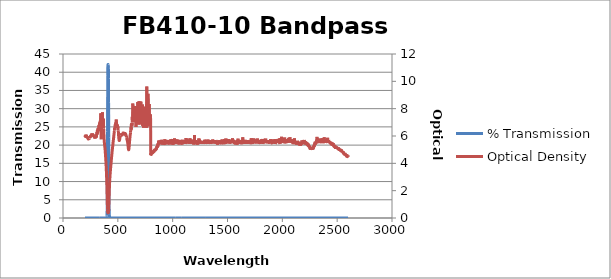
| Category | % Transmission |
|---|---|
| 2600.0 | 0.003 |
| 2599.0 | 0.003 |
| 2598.0 | 0.003 |
| 2597.0 | 0.003 |
| 2596.0 | 0.003 |
| 2595.0 | 0.003 |
| 2594.0 | 0.003 |
| 2593.0 | 0.003 |
| 2592.0 | 0.003 |
| 2591.0 | 0.003 |
| 2590.0 | 0.003 |
| 2589.0 | 0.003 |
| 2588.0 | 0.003 |
| 2587.0 | 0.003 |
| 2586.0 | 0.003 |
| 2585.0 | 0.003 |
| 2584.0 | 0.003 |
| 2583.0 | 0.002 |
| 2582.0 | 0.002 |
| 2581.0 | 0.003 |
| 2580.0 | 0.003 |
| 2579.0 | 0.002 |
| 2578.0 | 0.002 |
| 2577.0 | 0.002 |
| 2576.0 | 0.002 |
| 2575.0 | 0.002 |
| 2574.0 | 0.002 |
| 2573.0 | 0.002 |
| 2572.0 | 0.002 |
| 2571.0 | 0.002 |
| 2570.0 | 0.002 |
| 2569.0 | 0.003 |
| 2568.0 | 0.002 |
| 2567.0 | 0.002 |
| 2566.0 | 0.002 |
| 2565.0 | 0.002 |
| 2564.0 | 0.002 |
| 2563.0 | 0.002 |
| 2562.0 | 0.002 |
| 2561.0 | 0.002 |
| 2560.0 | 0.002 |
| 2559.0 | 0.002 |
| 2558.0 | 0.002 |
| 2557.0 | 0.002 |
| 2556.0 | 0.002 |
| 2555.0 | 0.001 |
| 2554.0 | 0.001 |
| 2553.0 | 0.002 |
| 2552.0 | 0.001 |
| 2551.0 | 0.001 |
| 2550.0 | 0.001 |
| 2549.0 | 0.002 |
| 2548.0 | 0.001 |
| 2547.0 | 0.001 |
| 2546.0 | 0.001 |
| 2545.0 | 0.001 |
| 2544.0 | 0.002 |
| 2543.0 | 0.001 |
| 2542.0 | 0.001 |
| 2541.0 | 0.001 |
| 2540.0 | 0.001 |
| 2539.0 | 0.001 |
| 2538.0 | 0.001 |
| 2537.0 | 0.001 |
| 2536.0 | 0.001 |
| 2535.0 | 0.001 |
| 2534.0 | 0.001 |
| 2533.0 | 0.001 |
| 2532.0 | 0.001 |
| 2531.0 | 0.001 |
| 2530.0 | 0.001 |
| 2529.0 | 0.001 |
| 2528.0 | 0.001 |
| 2527.0 | 0.001 |
| 2526.0 | 0.001 |
| 2525.0 | 0.001 |
| 2524.0 | 0.001 |
| 2523.0 | 0.001 |
| 2522.0 | 0.001 |
| 2521.0 | 0.001 |
| 2520.0 | 0.001 |
| 2519.0 | 0.001 |
| 2518.0 | 0.001 |
| 2517.0 | 0.001 |
| 2516.0 | 0.001 |
| 2515.0 | 0.001 |
| 2514.0 | 0.001 |
| 2513.0 | 0.001 |
| 2512.0 | 0.001 |
| 2511.0 | 0.001 |
| 2510.0 | 0.001 |
| 2509.0 | 0.001 |
| 2508.0 | 0.001 |
| 2507.0 | 0.001 |
| 2506.0 | 0.001 |
| 2505.0 | 0.001 |
| 2504.0 | 0.001 |
| 2503.0 | 0.001 |
| 2502.0 | 0.001 |
| 2501.0 | 0.001 |
| 2500.0 | 0.001 |
| 2499.0 | 0.001 |
| 2498.0 | 0.001 |
| 2497.0 | 0.001 |
| 2496.0 | 0.001 |
| 2495.0 | 0.001 |
| 2494.0 | 0.001 |
| 2493.0 | 0.001 |
| 2492.0 | 0.001 |
| 2491.0 | 0.001 |
| 2490.0 | 0.001 |
| 2489.0 | 0.001 |
| 2488.0 | 0.001 |
| 2487.0 | 0.001 |
| 2486.0 | 0.001 |
| 2485.0 | 0.001 |
| 2484.0 | 0.001 |
| 2483.0 | 0.001 |
| 2482.0 | 0.001 |
| 2481.0 | 0.001 |
| 2480.0 | 0 |
| 2479.0 | 0.001 |
| 2478.0 | 0 |
| 2477.0 | 0.001 |
| 2476.0 | 0.001 |
| 2475.0 | 0.001 |
| 2474.0 | 0 |
| 2473.0 | 0.001 |
| 2472.0 | 0.001 |
| 2471.0 | 0.001 |
| 2470.0 | 0 |
| 2469.0 | 0 |
| 2468.0 | 0 |
| 2467.0 | 0 |
| 2466.0 | 0 |
| 2465.0 | 0.001 |
| 2464.0 | 0 |
| 2463.0 | 0.001 |
| 2462.0 | 0 |
| 2461.0 | 0 |
| 2460.0 | 0 |
| 2459.0 | 0 |
| 2458.0 | 0 |
| 2457.0 | 0 |
| 2456.0 | 0.001 |
| 2455.0 | 0 |
| 2454.0 | 0 |
| 2453.0 | 0 |
| 2452.0 | 0 |
| 2451.0 | 0 |
| 2450.0 | 0 |
| 2449.0 | 0 |
| 2448.0 | 0 |
| 2447.0 | 0 |
| 2446.0 | 0 |
| 2445.0 | 0 |
| 2444.0 | 0 |
| 2443.0 | 0 |
| 2442.0 | 0 |
| 2441.0 | 0 |
| 2440.0 | 0 |
| 2439.0 | 0 |
| 2438.0 | 0 |
| 2437.0 | 0 |
| 2436.0 | 0 |
| 2435.0 | 0 |
| 2434.0 | 0 |
| 2433.0 | 0 |
| 2432.0 | 0 |
| 2431.0 | 0 |
| 2430.0 | 0 |
| 2429.0 | 0 |
| 2428.0 | 0 |
| 2427.0 | 0 |
| 2426.0 | 0 |
| 2425.0 | 0 |
| 2424.0 | 0 |
| 2423.0 | 0 |
| 2422.0 | 0 |
| 2421.0 | 0 |
| 2420.0 | 0 |
| 2419.0 | 0 |
| 2418.0 | 0 |
| 2417.0 | 0 |
| 2416.0 | 0 |
| 2415.0 | 0 |
| 2414.0 | 0 |
| 2413.0 | 0 |
| 2412.0 | 0 |
| 2411.0 | 0 |
| 2410.0 | 0 |
| 2409.0 | 0 |
| 2408.0 | 0 |
| 2407.0 | 0 |
| 2406.0 | 0 |
| 2405.0 | 0 |
| 2404.0 | 0 |
| 2403.0 | 0 |
| 2402.0 | 0 |
| 2401.0 | 0 |
| 2400.0 | 0 |
| 2399.0 | 0 |
| 2398.0 | 0 |
| 2397.0 | 0 |
| 2396.0 | 0 |
| 2395.0 | 0 |
| 2394.0 | 0 |
| 2393.0 | 0 |
| 2392.0 | 0 |
| 2391.0 | 0 |
| 2390.0 | 0 |
| 2389.0 | 0 |
| 2388.0 | 0 |
| 2387.0 | 0 |
| 2386.0 | 0 |
| 2385.0 | 0 |
| 2384.0 | 0 |
| 2383.0 | 0 |
| 2382.0 | 0 |
| 2381.0 | 0 |
| 2380.0 | 0 |
| 2379.0 | 0 |
| 2378.0 | 0 |
| 2377.0 | 0 |
| 2376.0 | 0 |
| 2375.0 | 0 |
| 2374.0 | 0 |
| 2373.0 | 0 |
| 2372.0 | 0 |
| 2371.0 | 0 |
| 2370.0 | 0 |
| 2369.0 | 0 |
| 2368.0 | 0 |
| 2367.0 | 0 |
| 2366.0 | 0 |
| 2365.0 | 0 |
| 2364.0 | 0 |
| 2363.0 | 0 |
| 2362.0 | 0 |
| 2361.0 | 0 |
| 2360.0 | 0 |
| 2359.0 | 0 |
| 2358.0 | 0 |
| 2357.0 | 0 |
| 2356.0 | 0 |
| 2355.0 | 0 |
| 2354.0 | 0 |
| 2353.0 | 0 |
| 2352.0 | 0 |
| 2351.0 | 0 |
| 2350.0 | 0 |
| 2349.0 | 0 |
| 2348.0 | 0 |
| 2347.0 | 0 |
| 2346.0 | 0 |
| 2345.0 | 0 |
| 2344.0 | 0 |
| 2343.0 | 0 |
| 2342.0 | 0 |
| 2341.0 | 0 |
| 2340.0 | 0 |
| 2339.0 | 0 |
| 2338.0 | 0 |
| 2337.0 | 0 |
| 2336.0 | 0 |
| 2335.0 | 0 |
| 2334.0 | 0 |
| 2333.0 | 0 |
| 2332.0 | 0 |
| 2331.0 | 0 |
| 2330.0 | 0 |
| 2329.0 | 0 |
| 2328.0 | 0 |
| 2327.0 | 0 |
| 2326.0 | 0 |
| 2325.0 | 0 |
| 2324.0 | 0 |
| 2323.0 | 0 |
| 2322.0 | 0 |
| 2321.0 | 0 |
| 2320.0 | 0 |
| 2319.0 | 0 |
| 2318.0 | 0 |
| 2317.0 | 0 |
| 2316.0 | 0 |
| 2315.0 | 0 |
| 2314.0 | 0 |
| 2313.0 | 0 |
| 2312.0 | 0 |
| 2311.0 | 0 |
| 2310.0 | 0 |
| 2309.0 | 0 |
| 2308.0 | 0 |
| 2307.0 | 0 |
| 2306.0 | 0 |
| 2305.0 | 0 |
| 2304.0 | 0 |
| 2303.0 | 0 |
| 2302.0 | 0 |
| 2301.0 | 0 |
| 2300.0 | 0 |
| 2299.0 | 0 |
| 2298.0 | 0 |
| 2297.0 | 0 |
| 2296.0 | 0 |
| 2295.0 | 0 |
| 2294.0 | 0 |
| 2293.0 | 0 |
| 2292.0 | 0 |
| 2291.0 | 0.001 |
| 2290.0 | 0.001 |
| 2289.0 | 0 |
| 2288.0 | 0.001 |
| 2287.0 | 0.001 |
| 2286.0 | 0.001 |
| 2285.0 | 0.001 |
| 2284.0 | 0.001 |
| 2283.0 | 0.001 |
| 2282.0 | 0.001 |
| 2281.0 | 0.001 |
| 2280.0 | 0.001 |
| 2279.0 | 0.001 |
| 2278.0 | 0.001 |
| 2277.0 | 0.001 |
| 2276.0 | 0.001 |
| 2275.0 | 0.001 |
| 2274.0 | 0.001 |
| 2273.0 | 0.001 |
| 2272.0 | 0.001 |
| 2271.0 | 0.001 |
| 2270.0 | 0.001 |
| 2269.0 | 0.001 |
| 2268.0 | 0.001 |
| 2267.0 | 0.001 |
| 2266.0 | 0.001 |
| 2265.0 | 0.001 |
| 2264.0 | 0.001 |
| 2263.0 | 0.001 |
| 2262.0 | 0.001 |
| 2261.0 | 0.001 |
| 2260.0 | 0.001 |
| 2259.0 | 0.001 |
| 2258.0 | 0.001 |
| 2257.0 | 0.001 |
| 2256.0 | 0.001 |
| 2255.0 | 0.001 |
| 2254.0 | 0.001 |
| 2253.0 | 0.001 |
| 2252.0 | 0.001 |
| 2251.0 | 0.001 |
| 2250.0 | 0.001 |
| 2249.0 | 0.001 |
| 2248.0 | 0.001 |
| 2247.0 | 0.001 |
| 2246.0 | 0.001 |
| 2245.0 | 0.001 |
| 2244.0 | 0.001 |
| 2243.0 | 0.001 |
| 2242.0 | 0 |
| 2241.0 | 0.001 |
| 2240.0 | 0.001 |
| 2239.0 | 0.001 |
| 2238.0 | 0 |
| 2237.0 | 0 |
| 2236.0 | 0.001 |
| 2235.0 | 0 |
| 2234.0 | 0.001 |
| 2233.0 | 0.001 |
| 2232.0 | 0 |
| 2231.0 | 0 |
| 2230.0 | 0 |
| 2229.0 | 0 |
| 2228.0 | 0 |
| 2227.0 | 0 |
| 2226.0 | 0 |
| 2225.0 | 0 |
| 2224.0 | 0 |
| 2223.0 | 0 |
| 2222.0 | 0 |
| 2221.0 | 0 |
| 2220.0 | 0 |
| 2219.0 | 0 |
| 2218.0 | 0 |
| 2217.0 | 0 |
| 2216.0 | 0 |
| 2215.0 | 0 |
| 2214.0 | 0 |
| 2213.0 | 0 |
| 2212.0 | 0 |
| 2211.0 | 0 |
| 2210.0 | 0 |
| 2209.0 | 0 |
| 2208.0 | 0 |
| 2207.0 | 0 |
| 2206.0 | 0 |
| 2205.0 | 0 |
| 2204.0 | 0 |
| 2203.0 | 0 |
| 2202.0 | 0 |
| 2201.0 | 0 |
| 2200.0 | 0 |
| 2199.0 | 0 |
| 2198.0 | 0 |
| 2197.0 | 0 |
| 2196.0 | 0 |
| 2195.0 | 0 |
| 2194.0 | 0 |
| 2193.0 | 0 |
| 2192.0 | 0 |
| 2191.0 | 0 |
| 2190.0 | 0 |
| 2189.0 | 0 |
| 2188.0 | 0 |
| 2187.0 | 0 |
| 2186.0 | 0 |
| 2185.0 | 0 |
| 2184.0 | 0 |
| 2183.0 | 0 |
| 2182.0 | 0 |
| 2181.0 | 0 |
| 2180.0 | 0 |
| 2179.0 | 0 |
| 2178.0 | 0 |
| 2177.0 | 0 |
| 2176.0 | 0 |
| 2175.0 | 0 |
| 2174.0 | 0 |
| 2173.0 | 0 |
| 2172.0 | 0 |
| 2171.0 | 0 |
| 2170.0 | 0 |
| 2169.0 | 0 |
| 2168.0 | 0 |
| 2167.0 | 0 |
| 2166.0 | 0 |
| 2165.0 | 0 |
| 2164.0 | 0.001 |
| 2163.0 | 0 |
| 2162.0 | 0 |
| 2161.0 | 0 |
| 2160.0 | 0 |
| 2159.0 | 0 |
| 2158.0 | 0 |
| 2157.0 | 0 |
| 2156.0 | 0 |
| 2155.0 | 0 |
| 2154.0 | 0 |
| 2153.0 | 0 |
| 2152.0 | 0 |
| 2151.0 | 0 |
| 2150.0 | 0 |
| 2149.0 | 0 |
| 2148.0 | 0 |
| 2147.0 | 0 |
| 2146.0 | 0 |
| 2145.0 | 0 |
| 2144.0 | 0 |
| 2143.0 | 0 |
| 2142.0 | 0 |
| 2141.0 | 0 |
| 2140.0 | 0 |
| 2139.0 | 0 |
| 2138.0 | 0 |
| 2137.0 | 0 |
| 2136.0 | 0 |
| 2135.0 | 0 |
| 2134.0 | 0 |
| 2133.0 | 0 |
| 2132.0 | 0 |
| 2131.0 | 0 |
| 2130.0 | 0 |
| 2129.0 | 0 |
| 2128.0 | 0 |
| 2127.0 | 0 |
| 2126.0 | 0 |
| 2125.0 | 0 |
| 2124.0 | 0 |
| 2123.0 | 0 |
| 2122.0 | 0 |
| 2121.0 | 0 |
| 2120.0 | 0 |
| 2119.0 | 0 |
| 2118.0 | 0 |
| 2117.0 | 0 |
| 2116.0 | 0 |
| 2115.0 | 0 |
| 2114.0 | 0 |
| 2113.0 | 0 |
| 2112.0 | 0 |
| 2111.0 | 0 |
| 2110.0 | 0 |
| 2109.0 | 0 |
| 2108.0 | 0 |
| 2107.0 | 0 |
| 2106.0 | 0 |
| 2105.0 | 0 |
| 2104.0 | 0 |
| 2103.0 | 0 |
| 2102.0 | 0 |
| 2101.0 | 0 |
| 2100.0 | 0 |
| 2099.0 | 0 |
| 2098.0 | 0 |
| 2097.0 | 0 |
| 2096.0 | 0 |
| 2095.0 | 0 |
| 2094.0 | 0 |
| 2093.0 | 0 |
| 2092.0 | 0 |
| 2091.0 | 0 |
| 2090.0 | 0 |
| 2089.0 | 0 |
| 2088.0 | 0 |
| 2087.0 | 0 |
| 2086.0 | 0 |
| 2085.0 | 0 |
| 2084.0 | 0 |
| 2083.0 | 0 |
| 2082.0 | 0 |
| 2081.0 | 0 |
| 2080.0 | 0 |
| 2079.0 | 0 |
| 2078.0 | 0 |
| 2077.0 | 0 |
| 2076.0 | 0 |
| 2075.0 | 0 |
| 2074.0 | 0 |
| 2073.0 | 0 |
| 2072.0 | 0 |
| 2071.0 | 0 |
| 2070.0 | 0 |
| 2069.0 | 0 |
| 2068.0 | 0 |
| 2067.0 | 0 |
| 2066.0 | 0 |
| 2065.0 | 0 |
| 2064.0 | 0 |
| 2063.0 | 0 |
| 2062.0 | 0 |
| 2061.0 | 0 |
| 2060.0 | 0 |
| 2059.0 | 0 |
| 2058.0 | 0 |
| 2057.0 | 0 |
| 2056.0 | 0 |
| 2055.0 | 0 |
| 2054.0 | 0 |
| 2053.0 | 0 |
| 2052.0 | 0 |
| 2051.0 | 0 |
| 2050.0 | 0 |
| 2049.0 | 0 |
| 2048.0 | 0 |
| 2047.0 | 0 |
| 2046.0 | 0 |
| 2045.0 | 0 |
| 2044.0 | 0 |
| 2043.0 | 0 |
| 2042.0 | 0 |
| 2041.0 | 0 |
| 2040.0 | 0 |
| 2039.0 | 0 |
| 2038.0 | 0 |
| 2037.0 | 0 |
| 2036.0 | 0 |
| 2035.0 | 0 |
| 2034.0 | 0 |
| 2033.0 | 0 |
| 2032.0 | 0 |
| 2031.0 | 0 |
| 2030.0 | 0 |
| 2029.0 | 0 |
| 2028.0 | 0 |
| 2027.0 | 0 |
| 2026.0 | 0 |
| 2025.0 | 0 |
| 2024.0 | 0 |
| 2023.0 | 0 |
| 2022.0 | 0 |
| 2021.0 | 0 |
| 2020.0 | 0 |
| 2019.0 | 0 |
| 2018.0 | 0 |
| 2017.0 | 0 |
| 2016.0 | 0 |
| 2015.0 | 0 |
| 2014.0 | 0 |
| 2013.0 | 0 |
| 2012.0 | 0 |
| 2011.0 | 0 |
| 2010.0 | 0 |
| 2009.0 | 0 |
| 2008.0 | 0 |
| 2007.0 | 0 |
| 2006.0 | 0 |
| 2005.0 | 0 |
| 2004.0 | 0 |
| 2003.0 | 0 |
| 2002.0 | 0 |
| 2001.0 | 0 |
| 2000.0 | 0 |
| 1999.0 | 0 |
| 1998.0 | 0 |
| 1997.0 | 0 |
| 1996.0 | 0 |
| 1995.0 | 0 |
| 1994.0 | 0 |
| 1993.0 | 0 |
| 1992.0 | 0 |
| 1991.0 | 0 |
| 1990.0 | 0 |
| 1989.0 | 0 |
| 1988.0 | 0 |
| 1987.0 | 0 |
| 1986.0 | 0 |
| 1985.0 | 0 |
| 1984.0 | 0 |
| 1983.0 | 0 |
| 1982.0 | 0 |
| 1981.0 | 0 |
| 1980.0 | 0 |
| 1979.0 | 0 |
| 1978.0 | 0 |
| 1977.0 | 0 |
| 1976.0 | 0 |
| 1975.0 | 0 |
| 1974.0 | 0 |
| 1973.0 | 0 |
| 1972.0 | 0 |
| 1971.0 | 0 |
| 1970.0 | 0 |
| 1969.0 | 0 |
| 1968.0 | 0 |
| 1967.0 | 0 |
| 1966.0 | 0 |
| 1965.0 | 0 |
| 1964.0 | 0 |
| 1963.0 | 0 |
| 1962.0 | 0 |
| 1961.0 | 0 |
| 1960.0 | 0 |
| 1959.0 | 0 |
| 1958.0 | 0 |
| 1957.0 | 0 |
| 1956.0 | 0 |
| 1955.0 | 0 |
| 1954.0 | 0 |
| 1953.0 | 0 |
| 1952.0 | 0 |
| 1951.0 | 0 |
| 1950.0 | 0 |
| 1949.0 | 0 |
| 1948.0 | 0 |
| 1947.0 | 0 |
| 1946.0 | 0 |
| 1945.0 | 0 |
| 1944.0 | 0 |
| 1943.0 | 0 |
| 1942.0 | 0 |
| 1941.0 | 0 |
| 1940.0 | 0 |
| 1939.0 | 0 |
| 1938.0 | 0 |
| 1937.0 | 0 |
| 1936.0 | 0 |
| 1935.0 | 0 |
| 1934.0 | 0 |
| 1933.0 | 0 |
| 1932.0 | 0 |
| 1931.0 | 0 |
| 1930.0 | 0 |
| 1929.0 | 0 |
| 1928.0 | 0 |
| 1927.0 | 0 |
| 1926.0 | 0 |
| 1925.0 | 0 |
| 1924.0 | 0 |
| 1923.0 | 0 |
| 1922.0 | 0 |
| 1921.0 | 0 |
| 1920.0 | 0 |
| 1919.0 | 0 |
| 1918.0 | 0 |
| 1917.0 | 0 |
| 1916.0 | 0 |
| 1915.0 | 0 |
| 1914.0 | 0 |
| 1913.0 | 0 |
| 1912.0 | 0 |
| 1911.0 | 0 |
| 1910.0 | 0 |
| 1909.0 | 0 |
| 1908.0 | 0 |
| 1907.0 | 0 |
| 1906.0 | 0 |
| 1905.0 | 0 |
| 1904.0 | 0 |
| 1903.0 | 0 |
| 1902.0 | 0 |
| 1901.0 | 0 |
| 1900.0 | 0 |
| 1899.0 | 0 |
| 1898.0 | 0 |
| 1897.0 | 0 |
| 1896.0 | 0 |
| 1895.0 | 0 |
| 1894.0 | 0 |
| 1893.0 | 0 |
| 1892.0 | 0 |
| 1891.0 | 0 |
| 1890.0 | 0 |
| 1889.0 | 0 |
| 1888.0 | 0 |
| 1887.0 | 0 |
| 1886.0 | 0 |
| 1885.0 | 0 |
| 1884.0 | 0 |
| 1883.0 | 0 |
| 1882.0 | 0 |
| 1881.0 | 0 |
| 1880.0 | 0 |
| 1879.0 | 0 |
| 1878.0 | 0 |
| 1877.0 | 0 |
| 1876.0 | 0 |
| 1875.0 | 0 |
| 1874.0 | 0 |
| 1873.0 | 0 |
| 1872.0 | 0 |
| 1871.0 | 0 |
| 1870.0 | 0 |
| 1869.0 | 0 |
| 1868.0 | 0 |
| 1867.0 | 0 |
| 1866.0 | 0 |
| 1865.0 | 0 |
| 1864.0 | 0 |
| 1863.0 | 0 |
| 1862.0 | 0 |
| 1861.0 | 0 |
| 1860.0 | 0 |
| 1859.0 | 0 |
| 1858.0 | 0 |
| 1857.0 | 0 |
| 1856.0 | 0 |
| 1855.0 | 0 |
| 1854.0 | 0 |
| 1853.0 | 0 |
| 1852.0 | 0 |
| 1851.0 | 0 |
| 1850.0 | 0 |
| 1849.0 | 0 |
| 1848.0 | 0 |
| 1847.0 | 0 |
| 1846.0 | 0 |
| 1845.0 | 0 |
| 1844.0 | 0 |
| 1843.0 | 0 |
| 1842.0 | 0 |
| 1841.0 | 0 |
| 1840.0 | 0 |
| 1839.0 | 0 |
| 1838.0 | 0 |
| 1837.0 | 0 |
| 1836.0 | 0 |
| 1835.0 | 0 |
| 1834.0 | 0 |
| 1833.0 | 0 |
| 1832.0 | 0 |
| 1831.0 | 0 |
| 1830.0 | 0 |
| 1829.0 | 0 |
| 1828.0 | 0 |
| 1827.0 | 0 |
| 1826.0 | 0 |
| 1825.0 | 0 |
| 1824.0 | 0 |
| 1823.0 | 0 |
| 1822.0 | 0 |
| 1821.0 | 0 |
| 1820.0 | 0 |
| 1819.0 | 0 |
| 1818.0 | 0 |
| 1817.0 | 0 |
| 1816.0 | 0 |
| 1815.0 | 0 |
| 1814.0 | 0 |
| 1813.0 | 0 |
| 1812.0 | 0 |
| 1811.0 | 0 |
| 1810.0 | 0 |
| 1809.0 | 0 |
| 1808.0 | 0 |
| 1807.0 | 0 |
| 1806.0 | 0 |
| 1805.0 | 0 |
| 1804.0 | 0 |
| 1803.0 | 0 |
| 1802.0 | 0 |
| 1801.0 | 0 |
| 1800.0 | 0 |
| 1799.0 | 0 |
| 1798.0 | 0 |
| 1797.0 | 0 |
| 1796.0 | 0 |
| 1795.0 | 0 |
| 1794.0 | 0 |
| 1793.0 | 0 |
| 1792.0 | 0 |
| 1791.0 | 0 |
| 1790.0 | 0 |
| 1789.0 | 0 |
| 1788.0 | 0 |
| 1787.0 | 0 |
| 1786.0 | 0 |
| 1785.0 | 0 |
| 1784.0 | 0 |
| 1783.0 | 0 |
| 1782.0 | 0 |
| 1781.0 | 0 |
| 1780.0 | 0 |
| 1779.0 | 0 |
| 1778.0 | 0 |
| 1777.0 | 0 |
| 1776.0 | 0 |
| 1775.0 | 0 |
| 1774.0 | 0 |
| 1773.0 | 0 |
| 1772.0 | 0 |
| 1771.0 | 0 |
| 1770.0 | 0 |
| 1769.0 | 0 |
| 1768.0 | 0 |
| 1767.0 | 0 |
| 1766.0 | 0 |
| 1765.0 | 0 |
| 1764.0 | 0 |
| 1763.0 | 0 |
| 1762.0 | 0 |
| 1761.0 | 0 |
| 1760.0 | 0 |
| 1759.0 | 0 |
| 1758.0 | 0 |
| 1757.0 | 0 |
| 1756.0 | 0 |
| 1755.0 | 0 |
| 1754.0 | 0 |
| 1753.0 | 0 |
| 1752.0 | 0 |
| 1751.0 | 0 |
| 1750.0 | 0 |
| 1749.0 | 0 |
| 1748.0 | 0 |
| 1747.0 | 0 |
| 1746.0 | 0 |
| 1745.0 | 0 |
| 1744.0 | 0 |
| 1743.0 | 0 |
| 1742.0 | 0 |
| 1741.0 | 0 |
| 1740.0 | 0 |
| 1739.0 | 0 |
| 1738.0 | 0 |
| 1737.0 | 0 |
| 1736.0 | 0 |
| 1735.0 | 0 |
| 1734.0 | 0 |
| 1733.0 | 0 |
| 1732.0 | 0 |
| 1731.0 | 0 |
| 1730.0 | 0 |
| 1729.0 | 0 |
| 1728.0 | 0 |
| 1727.0 | 0 |
| 1726.0 | 0 |
| 1725.0 | 0 |
| 1724.0 | 0 |
| 1723.0 | 0 |
| 1722.0 | 0 |
| 1721.0 | 0 |
| 1720.0 | 0 |
| 1719.0 | 0 |
| 1718.0 | 0 |
| 1717.0 | 0 |
| 1716.0 | 0 |
| 1715.0 | 0 |
| 1714.0 | 0 |
| 1713.0 | 0 |
| 1712.0 | 0 |
| 1711.0 | 0 |
| 1710.0 | 0 |
| 1709.0 | 0 |
| 1708.0 | 0 |
| 1707.0 | 0 |
| 1706.0 | 0 |
| 1705.0 | 0 |
| 1704.0 | 0 |
| 1703.0 | 0 |
| 1702.0 | 0 |
| 1701.0 | 0 |
| 1700.0 | 0 |
| 1699.0 | 0 |
| 1698.0 | 0 |
| 1697.0 | 0 |
| 1696.0 | 0 |
| 1695.0 | 0 |
| 1694.0 | 0 |
| 1693.0 | 0 |
| 1692.0 | 0 |
| 1691.0 | 0 |
| 1690.0 | 0 |
| 1689.0 | 0 |
| 1688.0 | 0 |
| 1687.0 | 0 |
| 1686.0 | 0 |
| 1685.0 | 0 |
| 1684.0 | 0 |
| 1683.0 | 0 |
| 1682.0 | 0 |
| 1681.0 | 0 |
| 1680.0 | 0 |
| 1679.0 | 0 |
| 1678.0 | 0 |
| 1677.0 | 0 |
| 1676.0 | 0 |
| 1675.0 | 0 |
| 1674.0 | 0 |
| 1673.0 | 0 |
| 1672.0 | 0 |
| 1671.0 | 0 |
| 1670.0 | 0 |
| 1669.0 | 0 |
| 1668.0 | 0 |
| 1667.0 | 0 |
| 1666.0 | 0 |
| 1665.0 | 0 |
| 1664.0 | 0 |
| 1663.0 | 0 |
| 1662.0 | 0 |
| 1661.0 | 0 |
| 1660.0 | 0 |
| 1659.0 | 0 |
| 1658.0 | 0 |
| 1657.0 | 0 |
| 1656.0 | 0 |
| 1655.0 | 0 |
| 1654.0 | 0 |
| 1653.0 | 0 |
| 1652.0 | 0 |
| 1651.0 | 0 |
| 1650.0 | 0 |
| 1649.0 | 0 |
| 1648.0 | 0 |
| 1647.0 | 0 |
| 1646.0 | 0 |
| 1645.0 | 0 |
| 1644.0 | 0 |
| 1643.0 | 0 |
| 1642.0 | 0 |
| 1641.0 | 0 |
| 1640.0 | 0 |
| 1639.0 | 0 |
| 1638.0 | 0 |
| 1637.0 | 0 |
| 1636.0 | 0 |
| 1635.0 | 0 |
| 1634.0 | 0 |
| 1633.0 | 0 |
| 1632.0 | 0 |
| 1631.0 | 0 |
| 1630.0 | 0 |
| 1629.0 | 0 |
| 1628.0 | 0 |
| 1627.0 | 0 |
| 1626.0 | 0 |
| 1625.0 | 0 |
| 1624.0 | 0 |
| 1623.0 | 0 |
| 1622.0 | 0 |
| 1621.0 | 0 |
| 1620.0 | 0 |
| 1619.0 | 0 |
| 1618.0 | 0 |
| 1617.0 | 0 |
| 1616.0 | 0 |
| 1615.0 | 0 |
| 1614.0 | 0 |
| 1613.0 | 0 |
| 1612.0 | 0 |
| 1611.0 | 0 |
| 1610.0 | 0 |
| 1609.0 | 0 |
| 1608.0 | 0 |
| 1607.0 | 0 |
| 1606.0 | 0 |
| 1605.0 | 0 |
| 1604.0 | 0 |
| 1603.0 | 0 |
| 1602.0 | 0 |
| 1601.0 | 0 |
| 1600.0 | 0 |
| 1599.0 | 0 |
| 1598.0 | 0 |
| 1597.0 | 0 |
| 1596.0 | 0 |
| 1595.0 | 0 |
| 1594.0 | 0 |
| 1593.0 | 0 |
| 1592.0 | 0 |
| 1591.0 | 0 |
| 1590.0 | 0 |
| 1589.0 | 0 |
| 1588.0 | 0 |
| 1587.0 | 0 |
| 1586.0 | 0 |
| 1585.0 | 0 |
| 1584.0 | 0 |
| 1583.0 | 0 |
| 1582.0 | 0 |
| 1581.0 | 0 |
| 1580.0 | 0 |
| 1579.0 | 0 |
| 1578.0 | 0 |
| 1577.0 | 0 |
| 1576.0 | 0 |
| 1575.0 | 0 |
| 1574.0 | 0 |
| 1573.0 | 0 |
| 1572.0 | 0 |
| 1571.0 | 0 |
| 1570.0 | 0 |
| 1569.0 | 0 |
| 1568.0 | 0 |
| 1567.0 | 0 |
| 1566.0 | 0 |
| 1565.0 | 0 |
| 1564.0 | 0 |
| 1563.0 | 0 |
| 1562.0 | 0 |
| 1561.0 | 0 |
| 1560.0 | 0 |
| 1559.0 | 0 |
| 1558.0 | 0 |
| 1557.0 | 0 |
| 1556.0 | 0 |
| 1555.0 | 0 |
| 1554.0 | 0 |
| 1553.0 | 0 |
| 1552.0 | 0 |
| 1551.0 | 0 |
| 1550.0 | 0 |
| 1549.0 | 0 |
| 1548.0 | 0 |
| 1547.0 | 0 |
| 1546.0 | 0 |
| 1545.0 | 0 |
| 1544.0 | 0 |
| 1543.0 | 0 |
| 1542.0 | 0 |
| 1541.0 | 0 |
| 1540.0 | 0 |
| 1539.0 | 0 |
| 1538.0 | 0 |
| 1537.0 | 0 |
| 1536.0 | 0 |
| 1535.0 | 0 |
| 1534.0 | 0 |
| 1533.0 | 0 |
| 1532.0 | 0 |
| 1531.0 | 0 |
| 1530.0 | 0 |
| 1529.0 | 0 |
| 1528.0 | 0 |
| 1527.0 | 0 |
| 1526.0 | 0 |
| 1525.0 | 0 |
| 1524.0 | 0 |
| 1523.0 | 0 |
| 1522.0 | 0 |
| 1521.0 | 0 |
| 1520.0 | 0 |
| 1519.0 | 0 |
| 1518.0 | 0 |
| 1517.0 | 0 |
| 1516.0 | 0 |
| 1515.0 | 0 |
| 1514.0 | 0 |
| 1513.0 | 0 |
| 1512.0 | 0 |
| 1511.0 | 0 |
| 1510.0 | 0 |
| 1509.0 | 0 |
| 1508.0 | 0 |
| 1507.0 | 0 |
| 1506.0 | 0 |
| 1505.0 | 0 |
| 1504.0 | 0 |
| 1503.0 | 0 |
| 1502.0 | 0 |
| 1501.0 | 0 |
| 1500.0 | 0 |
| 1499.0 | 0 |
| 1498.0 | 0 |
| 1497.0 | 0 |
| 1496.0 | 0 |
| 1495.0 | 0 |
| 1494.0 | 0 |
| 1493.0 | 0 |
| 1492.0 | 0 |
| 1491.0 | 0 |
| 1490.0 | 0 |
| 1489.0 | 0 |
| 1488.0 | 0 |
| 1487.0 | 0 |
| 1486.0 | 0 |
| 1485.0 | 0 |
| 1484.0 | 0 |
| 1483.0 | 0 |
| 1482.0 | 0 |
| 1481.0 | 0 |
| 1480.0 | 0 |
| 1479.0 | 0 |
| 1478.0 | 0 |
| 1477.0 | 0 |
| 1476.0 | 0 |
| 1475.0 | 0 |
| 1474.0 | 0 |
| 1473.0 | 0 |
| 1472.0 | 0 |
| 1471.0 | 0 |
| 1470.0 | 0 |
| 1469.0 | 0 |
| 1468.0 | 0 |
| 1467.0 | 0 |
| 1466.0 | 0 |
| 1465.0 | 0 |
| 1464.0 | 0 |
| 1463.0 | 0 |
| 1462.0 | 0 |
| 1461.0 | 0 |
| 1460.0 | 0 |
| 1459.0 | 0 |
| 1458.0 | 0 |
| 1457.0 | 0 |
| 1456.0 | 0 |
| 1455.0 | 0 |
| 1454.0 | 0 |
| 1453.0 | 0 |
| 1452.0 | 0 |
| 1451.0 | 0 |
| 1450.0 | 0 |
| 1449.0 | 0 |
| 1448.0 | 0 |
| 1447.0 | 0 |
| 1446.0 | 0 |
| 1445.0 | 0 |
| 1444.0 | 0 |
| 1443.0 | 0 |
| 1442.0 | 0 |
| 1441.0 | 0 |
| 1440.0 | 0 |
| 1439.0 | 0 |
| 1438.0 | 0 |
| 1437.0 | 0 |
| 1436.0 | 0 |
| 1435.0 | 0 |
| 1434.0 | 0 |
| 1433.0 | 0 |
| 1432.0 | 0 |
| 1431.0 | 0 |
| 1430.0 | 0 |
| 1429.0 | 0 |
| 1428.0 | 0 |
| 1427.0 | 0 |
| 1426.0 | 0 |
| 1425.0 | 0 |
| 1424.0 | 0 |
| 1423.0 | 0 |
| 1422.0 | 0 |
| 1421.0 | 0 |
| 1420.0 | 0 |
| 1419.0 | 0 |
| 1418.0 | 0 |
| 1417.0 | 0 |
| 1416.0 | 0 |
| 1415.0 | 0 |
| 1414.0 | 0 |
| 1413.0 | 0 |
| 1412.0 | 0 |
| 1411.0 | 0 |
| 1410.0 | 0 |
| 1409.0 | 0 |
| 1408.0 | 0 |
| 1407.0 | 0 |
| 1406.0 | 0 |
| 1405.0 | 0 |
| 1404.0 | 0 |
| 1403.0 | 0 |
| 1402.0 | 0 |
| 1401.0 | 0 |
| 1400.0 | 0 |
| 1399.0 | 0 |
| 1398.0 | 0 |
| 1397.0 | 0 |
| 1396.0 | 0 |
| 1395.0 | 0 |
| 1394.0 | 0 |
| 1393.0 | 0 |
| 1392.0 | 0 |
| 1391.0 | 0 |
| 1390.0 | 0 |
| 1389.0 | 0 |
| 1388.0 | 0 |
| 1387.0 | 0 |
| 1386.0 | 0 |
| 1385.0 | 0 |
| 1384.0 | 0 |
| 1383.0 | 0 |
| 1382.0 | 0 |
| 1381.0 | 0 |
| 1380.0 | 0 |
| 1379.0 | 0 |
| 1378.0 | 0 |
| 1377.0 | 0 |
| 1376.0 | 0 |
| 1375.0 | 0 |
| 1374.0 | 0 |
| 1373.0 | 0 |
| 1372.0 | 0 |
| 1371.0 | 0 |
| 1370.0 | 0 |
| 1369.0 | 0 |
| 1368.0 | 0 |
| 1367.0 | 0 |
| 1366.0 | 0 |
| 1365.0 | 0 |
| 1364.0 | 0 |
| 1363.0 | 0 |
| 1362.0 | 0 |
| 1361.0 | 0 |
| 1360.0 | 0 |
| 1359.0 | 0 |
| 1358.0 | 0 |
| 1357.0 | 0 |
| 1356.0 | 0 |
| 1355.0 | 0 |
| 1354.0 | 0 |
| 1353.0 | 0 |
| 1352.0 | 0 |
| 1351.0 | 0 |
| 1350.0 | 0 |
| 1349.0 | 0 |
| 1348.0 | 0 |
| 1347.0 | 0 |
| 1346.0 | 0 |
| 1345.0 | 0 |
| 1344.0 | 0 |
| 1343.0 | 0 |
| 1342.0 | 0 |
| 1341.0 | 0 |
| 1340.0 | 0 |
| 1339.0 | 0 |
| 1338.0 | 0 |
| 1337.0 | 0 |
| 1336.0 | 0 |
| 1335.0 | 0 |
| 1334.0 | 0 |
| 1333.0 | 0 |
| 1332.0 | 0 |
| 1331.0 | 0 |
| 1330.0 | 0 |
| 1329.0 | 0 |
| 1328.0 | 0 |
| 1327.0 | 0 |
| 1326.0 | 0 |
| 1325.0 | 0 |
| 1324.0 | 0 |
| 1323.0 | 0 |
| 1322.0 | 0 |
| 1321.0 | 0 |
| 1320.0 | 0 |
| 1319.0 | 0 |
| 1318.0 | 0 |
| 1317.0 | 0 |
| 1316.0 | 0 |
| 1315.0 | 0 |
| 1314.0 | 0 |
| 1313.0 | 0 |
| 1312.0 | 0 |
| 1311.0 | 0 |
| 1310.0 | 0 |
| 1309.0 | 0 |
| 1308.0 | 0 |
| 1307.0 | 0 |
| 1306.0 | 0 |
| 1305.0 | 0 |
| 1304.0 | 0 |
| 1303.0 | 0 |
| 1302.0 | 0 |
| 1301.0 | 0 |
| 1300.0 | 0 |
| 1299.0 | 0 |
| 1298.0 | 0 |
| 1297.0 | 0 |
| 1296.0 | 0 |
| 1295.0 | 0 |
| 1294.0 | 0 |
| 1293.0 | 0 |
| 1292.0 | 0 |
| 1291.0 | 0 |
| 1290.0 | 0 |
| 1289.0 | 0 |
| 1288.0 | 0 |
| 1287.0 | 0 |
| 1286.0 | 0 |
| 1285.0 | 0 |
| 1284.0 | 0 |
| 1283.0 | 0 |
| 1282.0 | 0 |
| 1281.0 | 0 |
| 1280.0 | 0 |
| 1279.0 | 0 |
| 1278.0 | 0 |
| 1277.0 | 0 |
| 1276.0 | 0 |
| 1275.0 | 0 |
| 1274.0 | 0 |
| 1273.0 | 0 |
| 1272.0 | 0 |
| 1271.0 | 0 |
| 1270.0 | 0 |
| 1269.0 | 0 |
| 1268.0 | 0 |
| 1267.0 | 0 |
| 1266.0 | 0 |
| 1265.0 | 0 |
| 1264.0 | 0 |
| 1263.0 | 0 |
| 1262.0 | 0 |
| 1261.0 | 0 |
| 1260.0 | 0 |
| 1259.0 | 0 |
| 1258.0 | 0 |
| 1257.0 | 0 |
| 1256.0 | 0 |
| 1255.0 | 0 |
| 1254.0 | 0 |
| 1253.0 | 0 |
| 1252.0 | 0 |
| 1251.0 | 0 |
| 1250.0 | 0 |
| 1249.0 | 0 |
| 1248.0 | 0 |
| 1247.0 | 0 |
| 1246.0 | 0 |
| 1245.0 | 0 |
| 1244.0 | 0 |
| 1243.0 | 0 |
| 1242.0 | 0 |
| 1241.0 | 0 |
| 1240.0 | 0 |
| 1239.0 | 0 |
| 1238.0 | 0 |
| 1237.0 | 0 |
| 1236.0 | 0 |
| 1235.0 | 0 |
| 1234.0 | 0 |
| 1233.0 | 0 |
| 1232.0 | 0 |
| 1231.0 | 0 |
| 1230.0 | 0 |
| 1229.0 | 0 |
| 1228.0 | 0 |
| 1227.0 | 0 |
| 1226.0 | 0 |
| 1225.0 | 0 |
| 1224.0 | 0 |
| 1223.0 | 0 |
| 1222.0 | 0 |
| 1221.0 | 0 |
| 1220.0 | 0 |
| 1219.0 | 0 |
| 1218.0 | 0 |
| 1217.0 | 0 |
| 1216.0 | 0 |
| 1215.0 | 0 |
| 1214.0 | 0 |
| 1213.0 | 0 |
| 1212.0 | 0 |
| 1211.0 | 0 |
| 1210.0 | 0 |
| 1209.0 | 0 |
| 1208.0 | 0 |
| 1207.0 | 0 |
| 1206.0 | 0 |
| 1205.0 | 0 |
| 1204.0 | 0 |
| 1203.0 | 0 |
| 1202.0 | 0 |
| 1201.0 | 0 |
| 1200.0 | 0 |
| 1199.0 | 0 |
| 1198.0 | 0 |
| 1197.0 | 0 |
| 1196.0 | 0 |
| 1195.0 | 0 |
| 1194.0 | 0 |
| 1193.0 | 0 |
| 1192.0 | 0 |
| 1191.0 | 0 |
| 1190.0 | 0 |
| 1189.0 | 0 |
| 1188.0 | 0 |
| 1187.0 | 0 |
| 1186.0 | 0 |
| 1185.0 | 0 |
| 1184.0 | 0 |
| 1183.0 | 0 |
| 1182.0 | 0 |
| 1181.0 | 0 |
| 1180.0 | 0 |
| 1179.0 | 0 |
| 1178.0 | 0 |
| 1177.0 | 0 |
| 1176.0 | 0 |
| 1175.0 | 0 |
| 1174.0 | 0 |
| 1173.0 | 0 |
| 1172.0 | 0 |
| 1171.0 | 0 |
| 1170.0 | 0 |
| 1169.0 | 0 |
| 1168.0 | 0 |
| 1167.0 | 0 |
| 1166.0 | 0 |
| 1165.0 | 0 |
| 1164.0 | 0 |
| 1163.0 | 0 |
| 1162.0 | 0 |
| 1161.0 | 0 |
| 1160.0 | 0 |
| 1159.0 | 0 |
| 1158.0 | 0 |
| 1157.0 | 0 |
| 1156.0 | 0 |
| 1155.0 | 0 |
| 1154.0 | 0 |
| 1153.0 | 0 |
| 1152.0 | 0 |
| 1151.0 | 0 |
| 1150.0 | 0 |
| 1149.0 | 0 |
| 1148.0 | 0 |
| 1147.0 | 0 |
| 1146.0 | 0 |
| 1145.0 | 0 |
| 1144.0 | 0 |
| 1143.0 | 0 |
| 1142.0 | 0 |
| 1141.0 | 0 |
| 1140.0 | 0 |
| 1139.0 | 0 |
| 1138.0 | 0 |
| 1137.0 | 0 |
| 1136.0 | 0 |
| 1135.0 | 0 |
| 1134.0 | 0 |
| 1133.0 | 0 |
| 1132.0 | 0 |
| 1131.0 | 0 |
| 1130.0 | 0 |
| 1129.0 | 0 |
| 1128.0 | 0 |
| 1127.0 | 0 |
| 1126.0 | 0 |
| 1125.0 | 0 |
| 1124.0 | 0 |
| 1123.0 | 0 |
| 1122.0 | 0 |
| 1121.0 | 0 |
| 1120.0 | 0 |
| 1119.0 | 0 |
| 1118.0 | 0 |
| 1117.0 | 0 |
| 1116.0 | 0 |
| 1115.0 | 0 |
| 1114.0 | 0 |
| 1113.0 | 0 |
| 1112.0 | 0 |
| 1111.0 | 0 |
| 1110.0 | 0 |
| 1109.0 | 0 |
| 1108.0 | 0 |
| 1107.0 | 0 |
| 1106.0 | 0 |
| 1105.0 | 0 |
| 1104.0 | 0 |
| 1103.0 | 0 |
| 1102.0 | 0 |
| 1101.0 | 0 |
| 1100.0 | 0 |
| 1099.0 | 0 |
| 1098.0 | 0 |
| 1097.0 | 0 |
| 1096.0 | 0 |
| 1095.0 | 0 |
| 1094.0 | 0 |
| 1093.0 | 0 |
| 1092.0 | 0 |
| 1091.0 | 0 |
| 1090.0 | 0 |
| 1089.0 | 0 |
| 1088.0 | 0 |
| 1087.0 | 0 |
| 1086.0 | 0 |
| 1085.0 | 0 |
| 1084.0 | 0 |
| 1083.0 | 0 |
| 1082.0 | 0 |
| 1081.0 | 0 |
| 1080.0 | 0 |
| 1079.0 | 0 |
| 1078.0 | 0 |
| 1077.0 | 0 |
| 1076.0 | 0 |
| 1075.0 | 0 |
| 1074.0 | 0 |
| 1073.0 | 0 |
| 1072.0 | 0 |
| 1071.0 | 0 |
| 1070.0 | 0 |
| 1069.0 | 0 |
| 1068.0 | 0 |
| 1067.0 | 0 |
| 1066.0 | 0 |
| 1065.0 | 0 |
| 1064.0 | 0 |
| 1063.0 | 0 |
| 1062.0 | 0 |
| 1061.0 | 0 |
| 1060.0 | 0 |
| 1059.0 | 0 |
| 1058.0 | 0 |
| 1057.0 | 0 |
| 1056.0 | 0 |
| 1055.0 | 0 |
| 1054.0 | 0 |
| 1053.0 | 0 |
| 1052.0 | 0 |
| 1051.0 | 0 |
| 1050.0 | 0 |
| 1049.0 | 0 |
| 1048.0 | 0 |
| 1047.0 | 0 |
| 1046.0 | 0 |
| 1045.0 | 0 |
| 1044.0 | 0 |
| 1043.0 | 0 |
| 1042.0 | 0 |
| 1041.0 | 0 |
| 1040.0 | 0 |
| 1039.0 | 0 |
| 1038.0 | 0 |
| 1037.0 | 0 |
| 1036.0 | 0 |
| 1035.0 | 0 |
| 1034.0 | 0 |
| 1033.0 | 0 |
| 1032.0 | 0 |
| 1031.0 | 0 |
| 1030.0 | 0 |
| 1029.0 | 0 |
| 1028.0 | 0 |
| 1027.0 | 0 |
| 1026.0 | 0 |
| 1025.0 | 0 |
| 1024.0 | 0 |
| 1023.0 | 0 |
| 1022.0 | 0 |
| 1021.0 | 0 |
| 1020.0 | 0 |
| 1019.0 | 0 |
| 1018.0 | 0 |
| 1017.0 | 0 |
| 1016.0 | 0 |
| 1015.0 | 0 |
| 1014.0 | 0 |
| 1013.0 | 0 |
| 1012.0 | 0 |
| 1011.0 | 0 |
| 1010.0 | 0 |
| 1009.0 | 0 |
| 1008.0 | 0 |
| 1007.0 | 0 |
| 1006.0 | 0 |
| 1005.0 | 0 |
| 1004.0 | 0 |
| 1003.0 | 0 |
| 1002.0 | 0 |
| 1001.0 | 0 |
| 1000.0 | 0 |
| 999.0 | 0 |
| 998.0 | 0 |
| 997.0 | 0 |
| 996.0 | 0 |
| 995.0 | 0 |
| 994.0 | 0 |
| 993.0 | 0 |
| 992.0 | 0 |
| 991.0 | 0 |
| 990.0 | 0 |
| 989.0 | 0 |
| 988.0 | 0 |
| 987.0 | 0 |
| 986.0 | 0 |
| 985.0 | 0 |
| 984.0 | 0 |
| 983.0 | 0 |
| 982.0 | 0 |
| 981.0 | 0 |
| 980.0 | 0 |
| 979.0 | 0 |
| 978.0 | 0 |
| 977.0 | 0 |
| 976.0 | 0 |
| 975.0 | 0 |
| 974.0 | 0 |
| 973.0 | 0 |
| 972.0 | 0 |
| 971.0 | 0 |
| 970.0 | 0 |
| 969.0 | 0 |
| 968.0 | 0 |
| 967.0 | 0 |
| 966.0 | 0 |
| 965.0 | 0 |
| 964.0 | 0 |
| 963.0 | 0 |
| 962.0 | 0 |
| 961.0 | 0 |
| 960.0 | 0 |
| 959.0 | 0 |
| 958.0 | 0 |
| 957.0 | 0 |
| 956.0 | 0 |
| 955.0 | 0 |
| 954.0 | 0 |
| 953.0 | 0 |
| 952.0 | 0 |
| 951.0 | 0 |
| 950.0 | 0 |
| 949.0 | 0 |
| 948.0 | 0 |
| 947.0 | 0 |
| 946.0 | 0 |
| 945.0 | 0 |
| 944.0 | 0 |
| 943.0 | 0 |
| 942.0 | 0 |
| 941.0 | 0 |
| 940.0 | 0 |
| 939.0 | 0 |
| 938.0 | 0 |
| 937.0 | 0 |
| 936.0 | 0 |
| 935.0 | 0 |
| 934.0 | 0 |
| 933.0 | 0 |
| 932.0 | 0 |
| 931.0 | 0 |
| 930.0 | 0 |
| 929.0 | 0 |
| 928.0 | 0 |
| 927.0 | 0 |
| 926.0 | 0 |
| 925.0 | 0 |
| 924.0 | 0 |
| 923.0 | 0 |
| 922.0 | 0 |
| 921.0 | 0 |
| 920.0 | 0 |
| 919.0 | 0 |
| 918.0 | 0 |
| 917.0 | 0 |
| 916.0 | 0 |
| 915.0 | 0 |
| 914.0 | 0 |
| 913.0 | 0 |
| 912.0 | 0 |
| 911.0 | 0 |
| 910.0 | 0 |
| 909.0 | 0 |
| 908.0 | 0 |
| 907.0 | 0 |
| 906.0 | 0 |
| 905.0 | 0 |
| 904.0 | 0 |
| 903.0 | 0 |
| 902.0 | 0 |
| 901.0 | 0 |
| 900.0 | 0 |
| 899.0 | 0 |
| 898.0 | 0 |
| 897.0 | 0 |
| 896.0 | 0 |
| 895.0 | 0 |
| 894.0 | 0 |
| 893.0 | 0 |
| 892.0 | 0 |
| 891.0 | 0 |
| 890.0 | 0 |
| 889.0 | 0 |
| 888.0 | 0 |
| 887.0 | 0 |
| 886.0 | 0 |
| 885.0 | 0 |
| 884.0 | 0 |
| 883.0 | 0 |
| 882.0 | 0 |
| 881.0 | 0 |
| 880.0 | 0 |
| 879.0 | 0 |
| 878.0 | 0 |
| 877.0 | 0 |
| 876.0 | 0 |
| 875.0 | 0 |
| 874.0 | 0 |
| 873.0 | 0 |
| 872.0 | 0 |
| 871.0 | 0 |
| 870.0 | 0 |
| 869.0 | 0 |
| 868.0 | 0 |
| 867.0 | 0 |
| 866.0 | 0.001 |
| 865.0 | 0.001 |
| 864.0 | 0.001 |
| 863.0 | 0.001 |
| 862.0 | 0 |
| 861.0 | 0.001 |
| 860.0 | 0.001 |
| 859.0 | 0.001 |
| 858.0 | 0.001 |
| 857.0 | 0.001 |
| 856.0 | 0.001 |
| 855.0 | 0.001 |
| 854.0 | 0.001 |
| 853.0 | 0.001 |
| 852.0 | 0.001 |
| 851.0 | 0.001 |
| 850.0 | 0.001 |
| 849.0 | 0.001 |
| 848.0 | 0.001 |
| 847.0 | 0.001 |
| 846.0 | 0.001 |
| 845.0 | 0.001 |
| 844.0 | 0.001 |
| 843.0 | 0.001 |
| 842.0 | 0.001 |
| 841.0 | 0.001 |
| 840.0 | 0.001 |
| 839.0 | 0.001 |
| 838.0 | 0.001 |
| 837.0 | 0.001 |
| 836.0 | 0.001 |
| 835.0 | 0.001 |
| 834.0 | 0.001 |
| 833.0 | 0.001 |
| 832.0 | 0.001 |
| 831.0 | 0.001 |
| 830.0 | 0.001 |
| 829.0 | 0.002 |
| 828.0 | 0.001 |
| 827.0 | 0.001 |
| 826.0 | 0.001 |
| 825.0 | 0.001 |
| 824.0 | 0.001 |
| 823.0 | 0.002 |
| 822.0 | 0.002 |
| 821.0 | 0.001 |
| 820.0 | 0.002 |
| 819.0 | 0.002 |
| 818.0 | 0.002 |
| 817.0 | 0.002 |
| 816.0 | 0.002 |
| 815.0 | 0.002 |
| 814.0 | 0.002 |
| 813.0 | 0.002 |
| 812.0 | 0.002 |
| 811.0 | 0.002 |
| 810.0 | 0.002 |
| 809.0 | 0.002 |
| 808.0 | 0.001 |
| 807.0 | 0.002 |
| 806.0 | 0.002 |
| 805.0 | 0.002 |
| 804.0 | 0.002 |
| 803.0 | 0.002 |
| 802.0 | 0.002 |
| 801.0 | 0.002 |
| 800.0 | 0.003 |
| 799.0 | 0 |
| 798.0 | 0 |
| 797.0 | 0 |
| 796.0 | 0 |
| 795.0 | 0 |
| 794.0 | 0 |
| 793.0 | 0 |
| 792.0 | 0 |
| 791.0 | 0 |
| 790.0 | 0 |
| 789.0 | 0 |
| 788.0 | 0 |
| 787.0 | 0 |
| 786.0 | 0 |
| 785.0 | 0 |
| 784.0 | 0 |
| 783.0 | 0 |
| 782.0 | 0 |
| 781.0 | 0 |
| 780.0 | 0 |
| 779.0 | 0 |
| 778.0 | 0 |
| 777.0 | 0 |
| 776.0 | 0 |
| 775.0 | 0 |
| 774.0 | 0 |
| 773.0 | 0 |
| 772.0 | 0 |
| 771.0 | 0 |
| 770.0 | 0 |
| 769.0 | 0 |
| 768.0 | 0 |
| 767.0 | 0 |
| 766.0 | 0 |
| 765.0 | 0 |
| 764.0 | 0 |
| 763.0 | 0 |
| 762.0 | 0 |
| 761.0 | 0 |
| 760.0 | 0 |
| 759.0 | 0 |
| 758.0 | 0 |
| 757.0 | 0 |
| 756.0 | 0 |
| 755.0 | 0 |
| 754.0 | 0 |
| 753.0 | 0 |
| 752.0 | 0 |
| 751.0 | 0 |
| 750.0 | 0 |
| 749.0 | 0 |
| 748.0 | 0 |
| 747.0 | 0 |
| 746.0 | 0 |
| 745.0 | 0 |
| 744.0 | 0 |
| 743.0 | 0 |
| 742.0 | 0 |
| 741.0 | 0 |
| 740.0 | 0 |
| 739.0 | 0 |
| 738.0 | 0 |
| 737.0 | 0 |
| 736.0 | 0 |
| 735.0 | 0 |
| 734.0 | 0 |
| 733.0 | 0 |
| 732.0 | 0 |
| 731.0 | 0 |
| 730.0 | 0 |
| 729.0 | 0 |
| 728.0 | 0 |
| 727.0 | 0 |
| 726.0 | 0 |
| 725.0 | 0 |
| 724.0 | 0 |
| 723.0 | 0 |
| 722.0 | 0 |
| 721.0 | 0 |
| 720.0 | 0 |
| 719.0 | 0 |
| 718.0 | 0 |
| 717.0 | 0 |
| 716.0 | 0 |
| 715.0 | 0 |
| 714.0 | 0 |
| 713.0 | 0 |
| 712.0 | 0 |
| 711.0 | 0 |
| 710.0 | 0 |
| 709.0 | 0 |
| 708.0 | 0 |
| 707.0 | 0 |
| 706.0 | 0 |
| 705.0 | 0 |
| 704.0 | 0 |
| 703.0 | 0 |
| 702.0 | 0 |
| 701.0 | 0 |
| 700.0 | 0 |
| 699.0 | 0 |
| 698.0 | 0 |
| 697.0 | 0 |
| 696.0 | 0 |
| 695.0 | 0 |
| 694.0 | 0 |
| 693.0 | 0 |
| 692.0 | 0 |
| 691.0 | 0 |
| 690.0 | 0 |
| 689.0 | 0 |
| 688.0 | 0 |
| 687.0 | 0 |
| 686.0 | 0 |
| 685.0 | 0 |
| 684.0 | 0 |
| 683.0 | 0 |
| 682.0 | 0 |
| 681.0 | 0 |
| 680.0 | 0 |
| 679.0 | 0 |
| 678.0 | 0 |
| 677.0 | 0 |
| 676.0 | 0 |
| 675.0 | 0 |
| 674.0 | 0 |
| 673.0 | 0 |
| 672.0 | 0 |
| 671.0 | 0 |
| 670.0 | 0 |
| 669.0 | 0 |
| 668.0 | 0 |
| 667.0 | 0 |
| 666.0 | 0 |
| 665.0 | 0 |
| 664.0 | 0 |
| 663.0 | 0 |
| 662.0 | 0 |
| 661.0 | 0 |
| 660.0 | 0 |
| 659.0 | 0 |
| 658.0 | 0 |
| 657.0 | 0 |
| 656.0 | 0 |
| 655.0 | 0 |
| 654.0 | 0 |
| 653.0 | 0 |
| 652.0 | 0 |
| 651.0 | 0 |
| 650.0 | 0 |
| 649.0 | 0 |
| 648.0 | 0 |
| 647.0 | 0 |
| 646.0 | 0 |
| 645.0 | 0 |
| 644.0 | 0 |
| 643.0 | 0 |
| 642.0 | 0 |
| 641.0 | 0 |
| 640.0 | 0 |
| 639.0 | 0 |
| 638.0 | 0 |
| 637.0 | 0 |
| 636.0 | 0 |
| 635.0 | 0 |
| 634.0 | 0 |
| 633.0 | 0 |
| 632.0 | 0 |
| 631.0 | 0 |
| 630.0 | 0 |
| 629.0 | 0 |
| 628.0 | 0 |
| 627.0 | 0 |
| 626.0 | 0 |
| 625.0 | 0 |
| 624.0 | 0 |
| 623.0 | 0 |
| 622.0 | 0 |
| 621.0 | 0 |
| 620.0 | 0 |
| 619.0 | 0 |
| 618.0 | 0 |
| 617.0 | 0 |
| 616.0 | 0 |
| 615.0 | 0 |
| 614.0 | 0 |
| 613.0 | 0 |
| 612.0 | 0 |
| 611.0 | 0 |
| 610.0 | 0 |
| 609.0 | 0 |
| 608.0 | 0 |
| 607.0 | 0 |
| 606.0 | 0 |
| 605.0 | 0 |
| 604.0 | 0 |
| 603.0 | 0.001 |
| 602.0 | 0.001 |
| 601.0 | 0.001 |
| 600.0 | 0.001 |
| 599.0 | 0.001 |
| 598.0 | 0.001 |
| 597.0 | 0.001 |
| 596.0 | 0.001 |
| 595.0 | 0.001 |
| 594.0 | 0.001 |
| 593.0 | 0.001 |
| 592.0 | 0 |
| 591.0 | 0 |
| 590.0 | 0 |
| 589.0 | 0 |
| 588.0 | 0 |
| 587.0 | 0 |
| 586.0 | 0 |
| 585.0 | 0 |
| 584.0 | 0 |
| 583.0 | 0 |
| 582.0 | 0 |
| 581.0 | 0 |
| 580.0 | 0 |
| 579.0 | 0 |
| 578.0 | 0 |
| 577.0 | 0 |
| 576.0 | 0 |
| 575.0 | 0 |
| 574.0 | 0 |
| 573.0 | 0 |
| 572.0 | 0 |
| 571.0 | 0 |
| 570.0 | 0 |
| 569.0 | 0 |
| 568.0 | 0 |
| 567.0 | 0 |
| 566.0 | 0 |
| 565.0 | 0 |
| 564.0 | 0 |
| 563.0 | 0 |
| 562.0 | 0 |
| 561.0 | 0 |
| 560.0 | 0 |
| 559.0 | 0 |
| 558.0 | 0 |
| 557.0 | 0 |
| 556.0 | 0 |
| 555.0 | 0 |
| 554.0 | 0 |
| 553.0 | 0 |
| 552.0 | 0 |
| 551.0 | 0 |
| 550.0 | 0 |
| 549.0 | 0 |
| 548.0 | 0 |
| 547.0 | 0 |
| 546.0 | 0 |
| 545.0 | 0 |
| 544.0 | 0 |
| 543.0 | 0 |
| 542.0 | 0 |
| 541.0 | 0 |
| 540.0 | 0 |
| 539.0 | 0 |
| 538.0 | 0 |
| 537.0 | 0 |
| 536.0 | 0 |
| 535.0 | 0 |
| 534.0 | 0 |
| 533.0 | 0 |
| 532.0 | 0 |
| 531.0 | 0 |
| 530.0 | 0 |
| 529.0 | 0 |
| 528.0 | 0 |
| 527.0 | 0 |
| 526.0 | 0 |
| 525.0 | 0 |
| 524.0 | 0 |
| 523.0 | 0 |
| 522.0 | 0 |
| 521.0 | 0 |
| 520.0 | 0 |
| 519.0 | 0 |
| 518.0 | 0 |
| 517.0 | 0 |
| 516.0 | 0 |
| 515.0 | 0 |
| 514.0 | 0 |
| 513.0 | 0 |
| 512.0 | 0 |
| 511.0 | 0 |
| 510.0 | 0 |
| 509.0 | 0 |
| 508.0 | 0 |
| 507.0 | 0 |
| 506.0 | 0 |
| 505.0 | 0 |
| 504.0 | 0 |
| 503.0 | 0 |
| 502.0 | 0 |
| 501.0 | 0 |
| 500.0 | 0 |
| 499.0 | 0 |
| 498.0 | 0 |
| 497.0 | 0 |
| 496.0 | 0 |
| 495.0 | 0 |
| 494.0 | 0 |
| 493.0 | 0 |
| 492.0 | 0 |
| 491.0 | 0 |
| 490.0 | 0 |
| 489.0 | 0 |
| 488.0 | 0 |
| 487.0 | 0 |
| 486.0 | 0 |
| 485.0 | 0 |
| 484.0 | 0 |
| 483.0 | 0 |
| 482.0 | 0 |
| 481.0 | 0 |
| 480.0 | 0 |
| 479.0 | 0 |
| 478.0 | 0 |
| 477.0 | 0 |
| 476.0 | 0 |
| 475.0 | 0 |
| 474.0 | 0 |
| 473.0 | 0 |
| 472.0 | 0 |
| 471.0 | 0 |
| 470.0 | 0 |
| 469.0 | 0 |
| 468.0 | 0 |
| 467.0 | 0 |
| 466.0 | 0 |
| 465.0 | 0 |
| 464.0 | 0 |
| 463.0 | 0 |
| 462.0 | 0 |
| 461.0 | 0 |
| 460.0 | 0 |
| 459.0 | 0 |
| 458.0 | 0 |
| 457.0 | 0 |
| 456.0 | 0 |
| 455.0 | 0 |
| 454.0 | 0 |
| 453.0 | 0.001 |
| 452.0 | 0.001 |
| 451.0 | 0.001 |
| 450.0 | 0.001 |
| 449.0 | 0.001 |
| 448.0 | 0.001 |
| 447.0 | 0.002 |
| 446.0 | 0.002 |
| 445.0 | 0.002 |
| 444.0 | 0.003 |
| 443.0 | 0.004 |
| 442.0 | 0.004 |
| 441.0 | 0.005 |
| 440.0 | 0.007 |
| 439.0 | 0.008 |
| 438.0 | 0.01 |
| 437.0 | 0.012 |
| 436.0 | 0.015 |
| 435.0 | 0.019 |
| 434.0 | 0.023 |
| 433.0 | 0.029 |
| 432.0 | 0.036 |
| 431.0 | 0.045 |
| 430.0 | 0.058 |
| 429.0 | 0.075 |
| 428.0 | 0.099 |
| 427.0 | 0.134 |
| 426.0 | 0.188 |
| 425.0 | 0.272 |
| 424.0 | 0.408 |
| 423.0 | 0.644 |
| 422.0 | 1.066 |
| 421.0 | 1.876 |
| 420.0 | 3.464 |
| 419.0 | 6.688 |
| 418.0 | 12.834 |
| 417.0 | 21.998 |
| 416.0 | 31.628 |
| 415.0 | 38.31 |
| 414.0 | 41.032 |
| 413.0 | 41.8 |
| 412.0 | 42.06 |
| 411.0 | 42.113 |
| 410.0 | 41.919 |
| 409.0 | 41.24 |
| 408.0 | 38.999 |
| 407.0 | 33.233 |
| 406.0 | 23.749 |
| 405.0 | 13.65 |
| 404.0 | 6.603 |
| 403.0 | 2.964 |
| 402.0 | 1.355 |
| 401.0 | 0.668 |
| 400.0 | 0.351 |
| 399.0 | 0.197 |
| 398.0 | 0.117 |
| 397.0 | 0.072 |
| 396.0 | 0.046 |
| 395.0 | 0.03 |
| 394.0 | 0.02 |
| 393.0 | 0.014 |
| 392.0 | 0.01 |
| 391.0 | 0.007 |
| 390.0 | 0.005 |
| 389.0 | 0.004 |
| 388.0 | 0.003 |
| 387.0 | 0.002 |
| 386.0 | 0.002 |
| 385.0 | 0.001 |
| 384.0 | 0.001 |
| 383.0 | 0.001 |
| 382.0 | 0.001 |
| 381.0 | 0.001 |
| 380.0 | 0 |
| 379.0 | 0 |
| 378.0 | 0 |
| 377.0 | 0 |
| 376.0 | 0 |
| 375.0 | 0 |
| 374.0 | 0 |
| 373.0 | 0 |
| 372.0 | 0 |
| 371.0 | 0 |
| 370.0 | 0 |
| 369.0 | 0 |
| 368.0 | 0 |
| 367.0 | 0 |
| 366.0 | 0 |
| 365.0 | 0 |
| 364.0 | 0 |
| 363.0 | 0 |
| 362.0 | 0 |
| 361.0 | 0 |
| 360.0 | 0 |
| 359.0 | 0 |
| 358.0 | 0 |
| 357.0 | 0 |
| 356.0 | 0 |
| 355.0 | 0 |
| 354.0 | 0 |
| 353.0 | 0 |
| 352.0 | 0 |
| 351.0 | 0 |
| 350.0 | 0 |
| 349.0 | 0 |
| 348.0 | 0 |
| 347.0 | 0 |
| 346.0 | 0 |
| 345.0 | 0 |
| 344.0 | 0 |
| 343.0 | 0 |
| 342.0 | 0 |
| 341.0 | 0 |
| 340.0 | 0 |
| 339.0 | 0 |
| 338.0 | 0 |
| 337.0 | 0 |
| 336.0 | 0 |
| 335.0 | 0 |
| 334.0 | 0 |
| 333.0 | 0 |
| 332.0 | 0 |
| 331.0 | 0 |
| 330.0 | 0 |
| 329.0 | 0 |
| 328.0 | 0 |
| 327.0 | 0 |
| 326.0 | 0 |
| 325.0 | 0 |
| 324.0 | 0 |
| 323.0 | 0 |
| 322.0 | 0 |
| 321.0 | 0 |
| 320.0 | 0 |
| 319.0 | 0 |
| 318.0 | 0 |
| 317.0 | 0 |
| 316.0 | 0 |
| 315.0 | 0 |
| 314.0 | 0 |
| 313.0 | 0 |
| 312.0 | 0 |
| 311.0 | 0 |
| 310.0 | 0 |
| 309.0 | 0 |
| 308.0 | 0 |
| 307.0 | 0 |
| 306.0 | 0 |
| 305.0 | 0 |
| 304.0 | 0 |
| 303.0 | 0 |
| 302.0 | 0 |
| 301.0 | 0 |
| 300.0 | 0 |
| 299.0 | 0 |
| 298.0 | 0 |
| 297.0 | 0 |
| 296.0 | 0 |
| 295.0 | 0 |
| 294.0 | 0 |
| 293.0 | 0 |
| 292.0 | 0 |
| 291.0 | 0 |
| 290.0 | 0 |
| 289.0 | 0 |
| 288.0 | 0 |
| 287.0 | 0 |
| 286.0 | 0 |
| 285.0 | 0 |
| 284.0 | 0 |
| 283.0 | 0 |
| 282.0 | 0 |
| 281.0 | 0 |
| 280.0 | 0 |
| 279.0 | 0 |
| 278.0 | 0 |
| 277.0 | 0 |
| 276.0 | 0 |
| 275.0 | 0 |
| 274.0 | 0 |
| 273.0 | 0 |
| 272.0 | 0 |
| 271.0 | 0 |
| 270.0 | 0 |
| 269.0 | 0 |
| 268.0 | 0 |
| 267.0 | 0 |
| 266.0 | 0 |
| 265.0 | 0 |
| 264.0 | 0 |
| 263.0 | 0 |
| 262.0 | 0 |
| 261.0 | 0 |
| 260.0 | 0 |
| 259.0 | 0 |
| 258.0 | 0 |
| 257.0 | 0 |
| 256.0 | 0 |
| 255.0 | 0 |
| 254.0 | 0 |
| 253.0 | 0 |
| 252.0 | 0 |
| 251.0 | 0 |
| 250.0 | 0 |
| 249.0 | 0 |
| 248.0 | 0 |
| 247.0 | 0 |
| 246.0 | 0 |
| 245.0 | 0 |
| 244.0 | 0 |
| 243.0 | 0 |
| 242.0 | 0 |
| 241.0 | 0 |
| 240.0 | 0 |
| 239.0 | 0 |
| 238.0 | 0 |
| 237.0 | 0 |
| 236.0 | 0 |
| 235.0 | 0 |
| 234.0 | 0 |
| 233.0 | 0 |
| 232.0 | 0 |
| 231.0 | 0 |
| 230.0 | 0 |
| 229.0 | 0 |
| 228.0 | 0 |
| 227.0 | 0 |
| 226.0 | 0 |
| 225.0 | 0 |
| 224.0 | 0 |
| 223.0 | 0 |
| 222.0 | 0 |
| 221.0 | 0 |
| 220.0 | 0 |
| 219.0 | 0 |
| 218.0 | 0 |
| 217.0 | 0 |
| 216.0 | 0 |
| 215.0 | 0 |
| 214.0 | 0 |
| 213.0 | 0 |
| 212.0 | 0 |
| 211.0 | 0 |
| 210.0 | 0 |
| 209.0 | 0 |
| 208.0 | 0 |
| 207.0 | 0 |
| 206.0 | 0 |
| 205.0 | 0 |
| 204.0 | 0 |
| 203.0 | 0 |
| 202.0 | 0 |
| 201.0 | 0 |